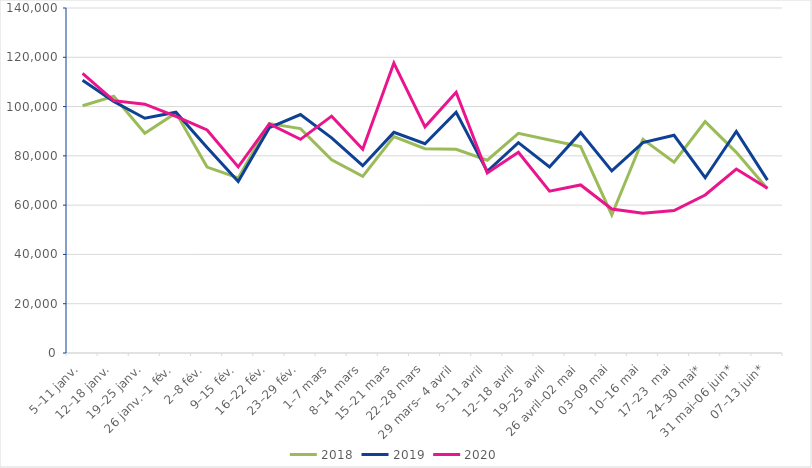
| Category | 2018 | 2019 | 2020 |
|---|---|---|---|
| 5–11 janv. | 100330 | 110701 | 113506 |
| 12–18 janv. | 104190 | 102045 | 102407 |
| 19–25 janv. | 89142 | 95260 | 100966 |
| 26 janv.–1 fév. | 97441 | 97699 | 96042 |
| 2–8 fév. | 75434 | 83347 | 90495 |
| 9–15 fév. | 71031 | 69559 | 75523 |
| 16–22 fév. | 93102 | 91428 | 93003 |
| 23–29 fév. | 91065 | 96774 | 86699 |
| 1–7 mars | 78415 | 87314 | 96119 |
| 8–14 mars | 71697 | 76021 | 82690 |
| 15–21 mars | 87845 | 89536 | 117673 |
| 22–28 mars | 82895 | 84912 | 91763.636 |
| 29 mars– 4 avril | 82654 | 97699 | 105802 |
| 5–11 avril | 78244 | 73699 | 73060.606 |
| 12–18 avril | 89129 | 85348 | 81477 |
| 19–25 avril | 86398 | 75509 | 65653 |
| 26 avril–02 mai | 83743 | 89413 | 68188 |
| 03–09 mai | 56008 | 73891 | 58423 |
| 10–16 mai | 86722 | 85364 | 56762 |
| 17–23  mai | 77423 | 88345 | 57817 |
| 24–30 mai* | 93888 | 71115 | 64117 |
| 31 mai–06 juin* | 81416 | 89880 | 74658 |
| 07–13 juin* | 66658 | 70150 | 66822 |